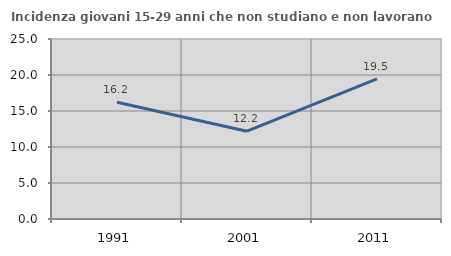
| Category | Incidenza giovani 15-29 anni che non studiano e non lavorano  |
|---|---|
| 1991.0 | 16.216 |
| 2001.0 | 12.195 |
| 2011.0 | 19.471 |